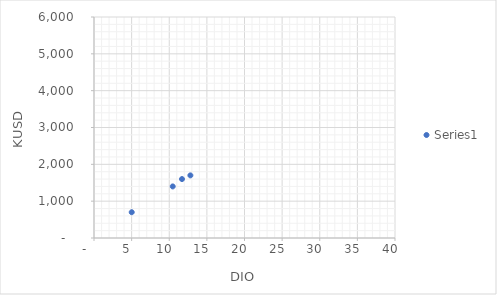
| Category | Series 0 |
|---|---|
| 10.461114231591004 | 1400 |
| 12.80887574616181 | 1700 |
| 11.693351175136014 | 1600 |
| 5.012489261878015 | 700 |